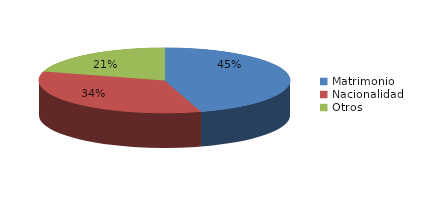
| Category | Series 0 |
|---|---|
| Matrimonio | 2234 |
| Nacionalidad | 1682 |
| Otros | 1012 |